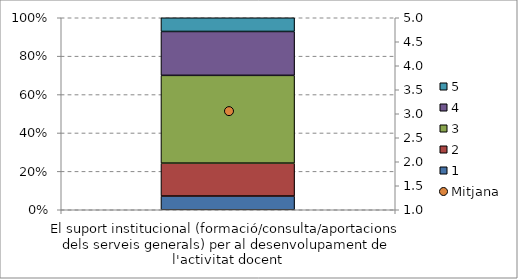
| Category | 1 | 2 | 3 | 4 | 5 |
|---|---|---|---|---|---|
| El suport institucional (formació/consulta/aportacions dels serveis generals) per al desenvolupament de l'activitat docent | 0.071 | 0.171 | 0.457 | 0.229 | 0.071 |